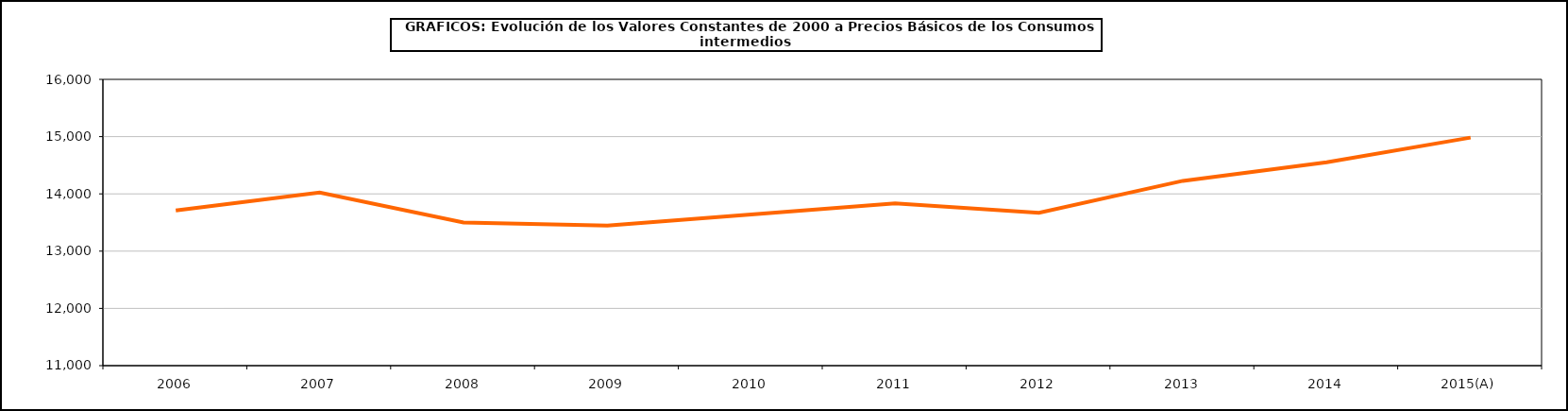
| Category | Total consumos intermedios |
|---|---|
| 2006 | 13712.1 |
| 2007 | 14024.9 |
| 2008 | 13501.9 |
| 2009 | 13446.9 |
| 2010 | 13642 |
| 2011 | 13835.8 |
| 2012 | 13669.3 |
| 2013 | 14227.7 |
| 2014 | 14550.6 |
| 2015(A) | 14982.7 |